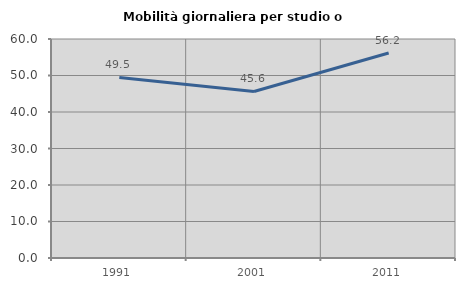
| Category | Mobilità giornaliera per studio o lavoro |
|---|---|
| 1991.0 | 49.484 |
| 2001.0 | 45.623 |
| 2011.0 | 56.166 |